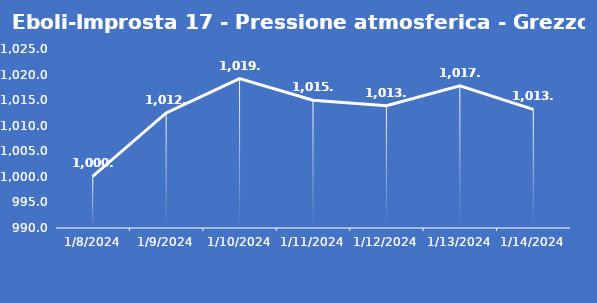
| Category | Eboli-Improsta 17 - Pressione atmosferica - Grezzo (hPa) |
|---|---|
| 1/8/24 | 1000.1 |
| 1/9/24 | 1012.5 |
| 1/10/24 | 1019.2 |
| 1/11/24 | 1015 |
| 1/12/24 | 1013.9 |
| 1/13/24 | 1017.8 |
| 1/14/24 | 1013.2 |